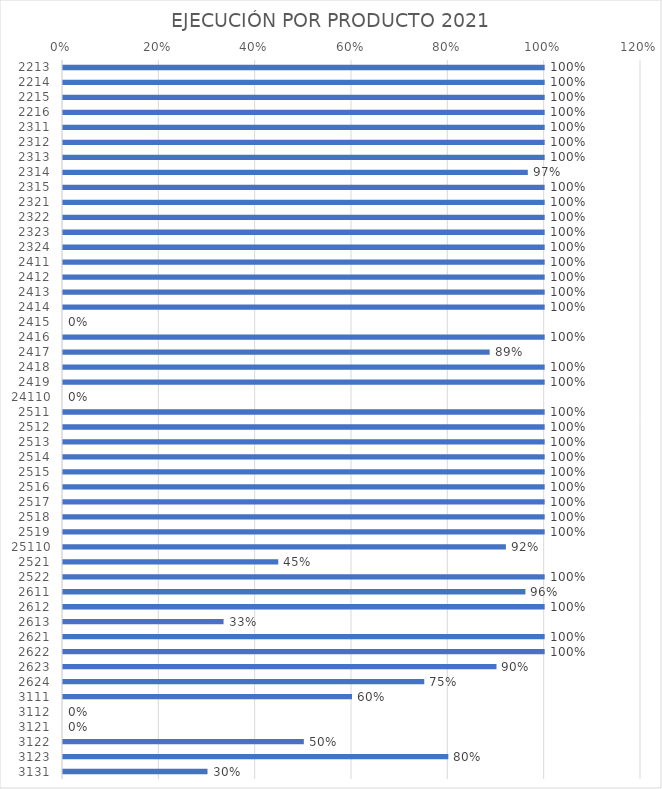
| Category | Series 0 |
|---|---|
| 2213.0 | 1 |
| 2214.0 | 1 |
| 2215.0 | 1 |
| 2216.0 | 1 |
| 2311.0 | 1 |
| 2312.0 | 1 |
| 2313.0 | 1 |
| 2314.0 | 0.965 |
| 2315.0 | 1 |
| 2321.0 | 1 |
| 2322.0 | 1 |
| 2323.0 | 1 |
| 2324.0 | 1 |
| 2411.0 | 1 |
| 2412.0 | 1 |
| 2413.0 | 1 |
| 2414.0 | 1 |
| 2415.0 | 0 |
| 2416.0 | 1 |
| 2417.0 | 0.886 |
| 2418.0 | 1 |
| 2419.0 | 1 |
| 24110.0 | 0 |
| 2511.0 | 1 |
| 2512.0 | 1 |
| 2513.0 | 1 |
| 2514.0 | 1 |
| 2515.0 | 1 |
| 2516.0 | 1 |
| 2517.0 | 1 |
| 2518.0 | 1 |
| 2519.0 | 1 |
| 25110.0 | 0.92 |
| 2521.0 | 0.447 |
| 2522.0 | 1 |
| 2611.0 | 0.96 |
| 2612.0 | 1 |
| 2613.0 | 0.333 |
| 2621.0 | 1 |
| 2622.0 | 1 |
| 2623.0 | 0.9 |
| 2624.0 | 0.75 |
| 3111.0 | 0.6 |
| 3112.0 | 0 |
| 3121.0 | 0 |
| 3122.0 | 0.5 |
| 3123.0 | 0.8 |
| 3131.0 | 0.3 |